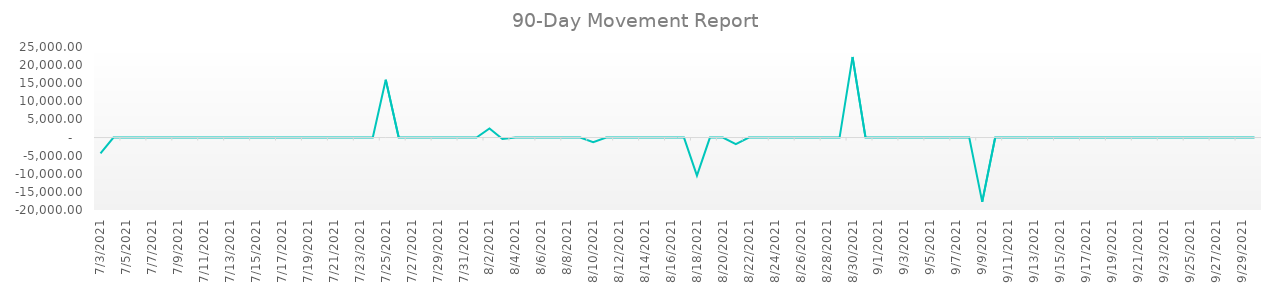
| Category | Value |
|---|---|
| 7/3/21 | -4384 |
| 7/4/21 | 0 |
| 7/5/21 | 0 |
| 7/6/21 | 0 |
| 7/7/21 | 0 |
| 7/8/21 | 0 |
| 7/9/21 | 0 |
| 7/10/21 | 0 |
| 7/11/21 | 0 |
| 7/12/21 | 0 |
| 7/13/21 | 0 |
| 7/14/21 | 0 |
| 7/15/21 | 0 |
| 7/16/21 | 0 |
| 7/17/21 | 0 |
| 7/18/21 | 0 |
| 7/19/21 | 0 |
| 7/20/21 | 0 |
| 7/21/21 | 0 |
| 7/22/21 | 0 |
| 7/23/21 | 0 |
| 7/24/21 | 0 |
| 7/25/21 | 15948 |
| 7/26/21 | 0 |
| 7/27/21 | 0 |
| 7/28/21 | 0 |
| 7/29/21 | 0 |
| 7/30/21 | 0 |
| 7/31/21 | 0 |
| 8/1/21 | 0 |
| 8/2/21 | 2532 |
| 8/3/21 | -410 |
| 8/4/21 | 0 |
| 8/5/21 | 0 |
| 8/6/21 | 0 |
| 8/7/21 | 0 |
| 8/8/21 | 0 |
| 8/9/21 | 0 |
| 8/10/21 | -1301 |
| 8/11/21 | 0 |
| 8/12/21 | 0 |
| 8/13/21 | 0 |
| 8/14/21 | 0 |
| 8/15/21 | 0 |
| 8/16/21 | 0 |
| 8/17/21 | 0 |
| 8/18/21 | -10523 |
| 8/19/21 | 0 |
| 8/20/21 | 0 |
| 8/21/21 | -1809 |
| 8/22/21 | 0 |
| 8/23/21 | 0 |
| 8/24/21 | 0 |
| 8/25/21 | 0 |
| 8/26/21 | 0 |
| 8/27/21 | 0 |
| 8/28/21 | 0 |
| 8/29/21 | 0 |
| 8/30/21 | 22230 |
| 8/31/21 | 0 |
| 9/1/21 | 0 |
| 9/2/21 | 0 |
| 9/3/21 | 0 |
| 9/4/21 | 0 |
| 9/5/21 | 0 |
| 9/6/21 | 0 |
| 9/7/21 | 0 |
| 9/8/21 | 0 |
| 9/9/21 | -17769.155 |
| 9/10/21 | 0 |
| 9/11/21 | 0 |
| 9/12/21 | 0 |
| 9/13/21 | 0 |
| 9/14/21 | 0 |
| 9/15/21 | 0 |
| 9/16/21 | 0 |
| 9/17/21 | 0 |
| 9/18/21 | 0 |
| 9/19/21 | 0 |
| 9/20/21 | 0 |
| 9/21/21 | 0 |
| 9/22/21 | 0 |
| 9/23/21 | 0 |
| 9/24/21 | 0 |
| 9/25/21 | 0 |
| 9/26/21 | 0 |
| 9/27/21 | 0 |
| 9/28/21 | 0 |
| 9/29/21 | 0 |
| 9/30/21 | 0 |